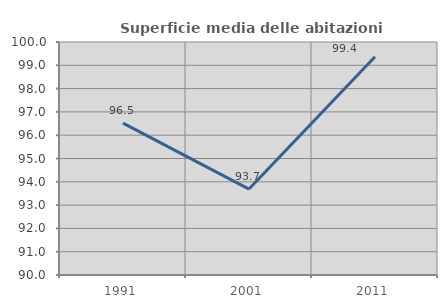
| Category | Superficie media delle abitazioni occupate |
|---|---|
| 1991.0 | 96.517 |
| 2001.0 | 93.689 |
| 2011.0 | 99.367 |